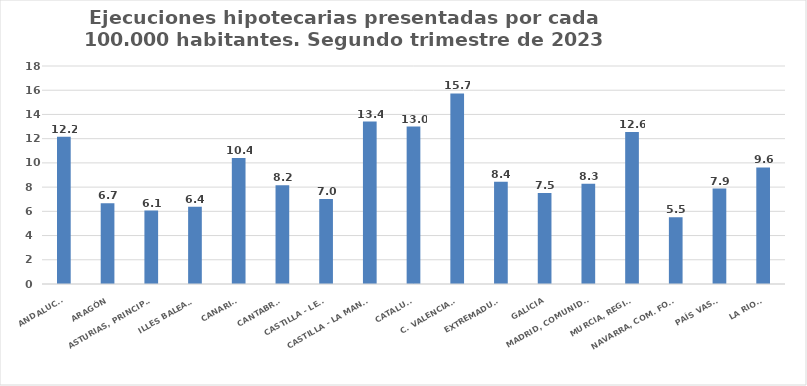
| Category | Series 0 |
|---|---|
| ANDALUCÍA | 12.167 |
| ARAGÓN | 6.67 |
| ASTURIAS, PRINCIPADO | 6.06 |
| ILLES BALEARS | 6.381 |
| CANARIAS | 10.394 |
| CANTABRIA | 8.156 |
| CASTILLA - LEÓN | 7.009 |
| CASTILLA - LA MANCHA | 13.409 |
| CATALUÑA | 13.002 |
| C. VALENCIANA | 15.733 |
| EXTREMADURA | 8.442 |
| GALICIA | 7.519 |
| MADRID, COMUNIDAD | 8.279 |
| MURCIA, REGIÓN | 12.559 |
| NAVARRA, COM. FORAL | 5.504 |
| PAÍS VASCO | 7.883 |
| LA RIOJA | 9.619 |